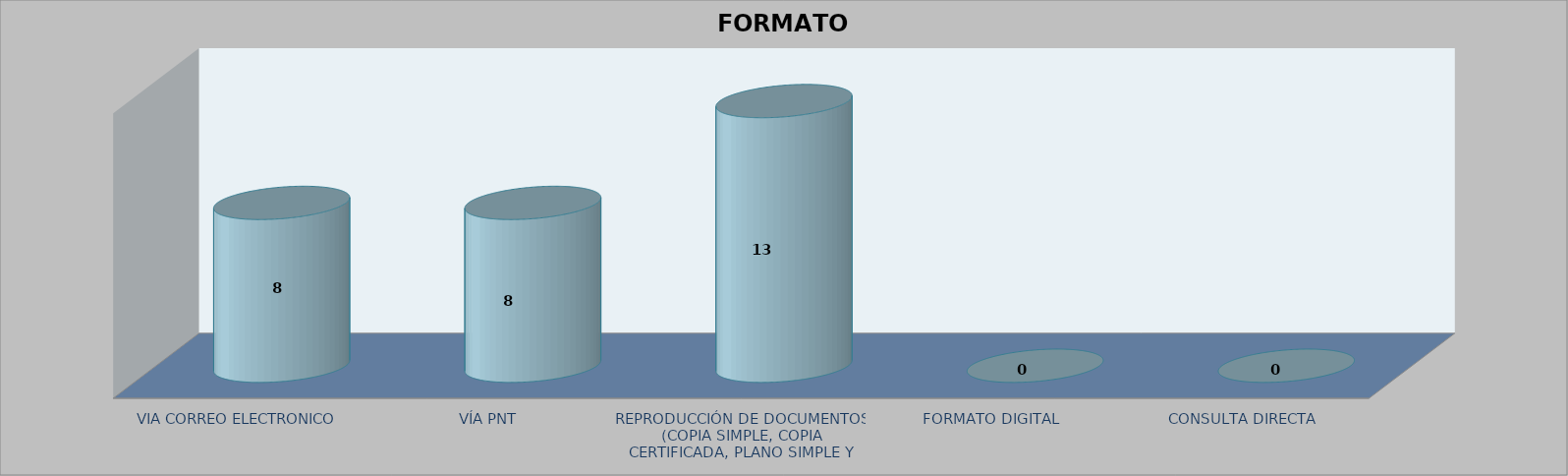
| Category |        FORMATO SOLICITADO | Series 1 | Series 2 |
|---|---|---|---|
| VIA CORREO ELECTRONICO |  |  | 8 |
| VÍA PNT |  |  | 8 |
| REPRODUCCIÓN DE DOCUMENTOS (COPIA SIMPLE, COPIA CERTIFICADA, PLANO SIMPLE Y PLANO CERTIFICADO) |  |  | 13 |
| FORMATO DIGITAL |  |  | 0 |
| CONSULTA DIRECTA |  |  | 0 |